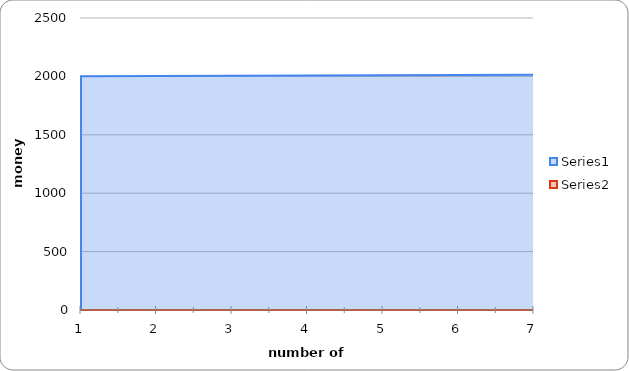
| Category | Series 0 | Series 1 |
|---|---|---|
| 0 | 2002 | 0 |
| 1 | 2004 | 0 |
| 2 | 2006 | 0 |
| 3 | 2008 | 0 |
| 4 | 2010 | 0 |
| 5 | 2012 | 0 |
| 6 | 2014 | 0 |